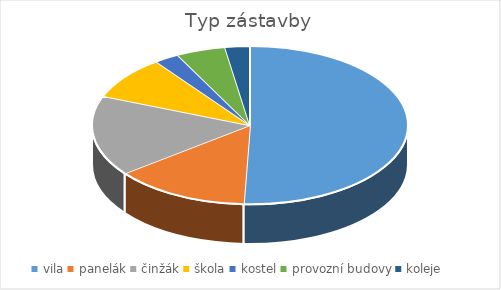
| Category | Series 0 |
|---|---|
| vila | 40 |
| panelák | 11 |
| činžák | 13 |
| škola | 7 |
| kostel | 2 |
| provozní budovy | 4 |
| koleje | 2 |